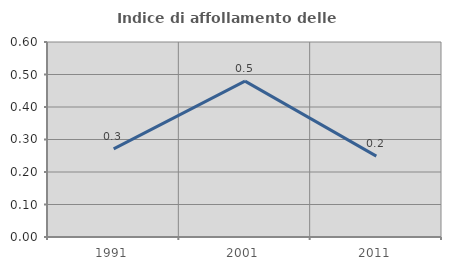
| Category | Indice di affollamento delle abitazioni  |
|---|---|
| 1991.0 | 0.271 |
| 2001.0 | 0.48 |
| 2011.0 | 0.249 |